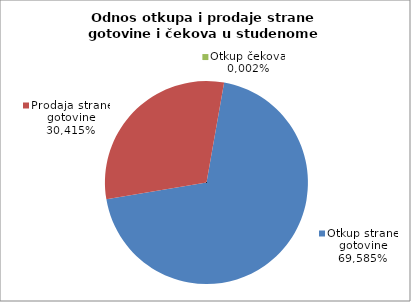
| Category | Otkup strane gotovine |
|---|---|
| 0 | 0.696 |
| 1 | 0.304 |
| 2 | 0 |